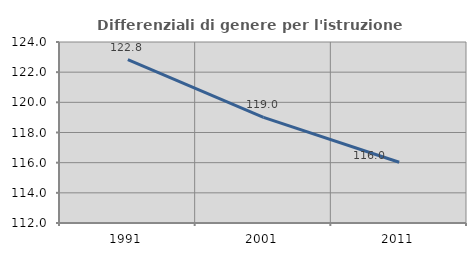
| Category | Differenziali di genere per l'istruzione superiore |
|---|---|
| 1991.0 | 122.835 |
| 2001.0 | 118.999 |
| 2011.0 | 116.031 |